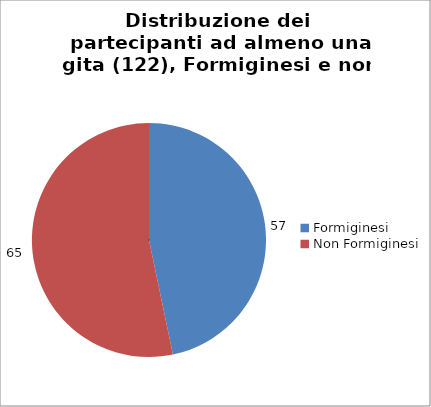
| Category | Nr. Tesserati |
|---|---|
| Formiginesi | 57 |
| Non Formiginesi | 65 |